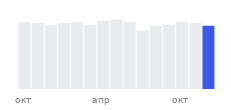
| Category | Цены |
|---|---|
| окт |  |
|  |  |
|  |  |
|  |  |
|  |  |
|  |  |
| апр |  |
|  |  |
|  |  |
|  |  |
|  |  |
|  |  |
| окт |  |